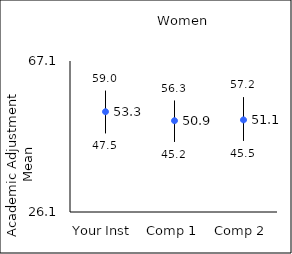
| Category | 25th percentile | 75th percentile | Mean |
|---|---|---|---|
| Your Inst | 47.5 | 59 | 53.33 |
| Comp 1 | 45.2 | 56.3 | 50.89 |
| Comp 2 | 45.5 | 57.2 | 51.11 |